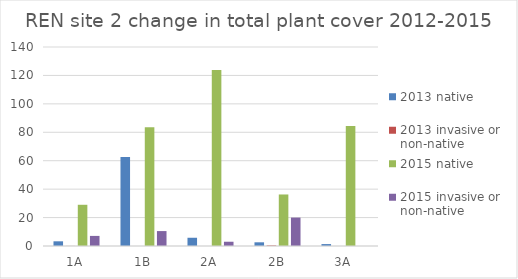
| Category | 2013 | 2015 |
|---|---|---|
| 1A | 0.05 | 7.1 |
| 1B | 0 | 10.5 |
| 2A | 0 | 3 |
| 2B | 0.4 | 20 |
| 3A | 0 | 0 |